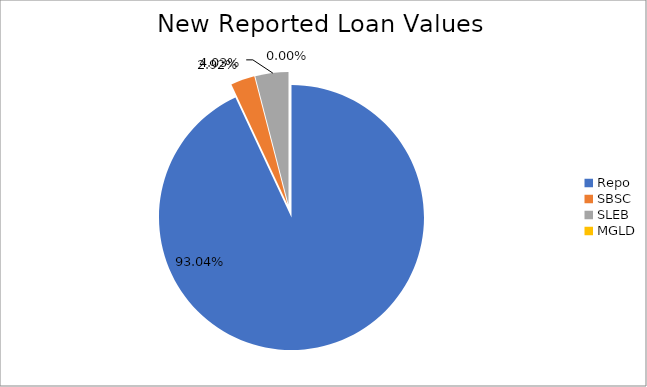
| Category | Series 0 |
|---|---|
| Repo | 9367420.771 |
| SBSC | 294026.005 |
| SLEB | 405944.338 |
| MGLD | 276.252 |